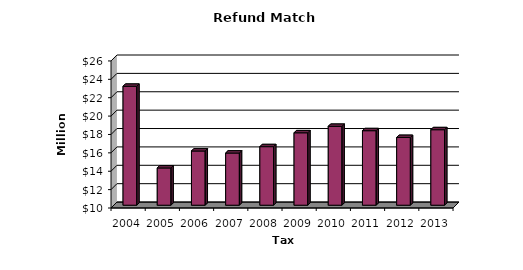
| Category | Total |
|---|---|
| 2004.0 | 22.937 |
| 2005.0 | 14.052 |
| 2006.0 | 15.896 |
| 2007.0 | 15.673 |
| 2008.0 | 16.367 |
| 2009.0 | 17.876 |
| 2010.0 | 18.578 |
| 2011.0 | 18.105 |
| 2012.0 | 17.369 |
| 2013.0 | 18.212 |